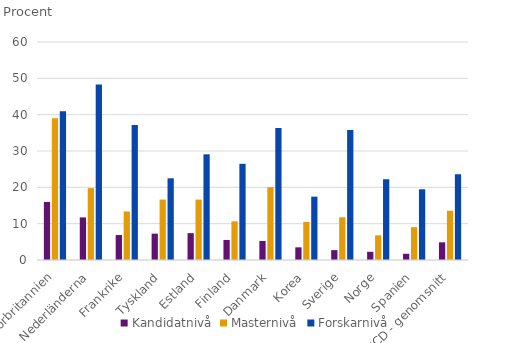
| Category | Kandidatnivå | Masternivå | Forskarnivå |
|---|---|---|---|
| Storbritannien | 15.98 | 38.994 | 40.92 |
| Nederländerna | 11.727 | 19.79 | 48.328 |
| Frankrike | 6.869 | 13.36 | 37.144 |
| Tyskland | 7.255 | 16.639 | 22.484 |
| Estland | 7.393 | 16.63 | 29.089 |
| Finland | 5.517 | 10.644 | 26.474 |
| Danmark | 5.246 | 20.036 | 36.311 |
| Korea | 3.491 | 10.476 | 17.437 |
| Sverige | 2.718 | 11.753 | 35.801 |
| Norge | 2.258 | 6.793 | 22.231 |
| Spanien | 1.718 | 9.039 | 19.464 |
| OECD - genomsnitt | 4.868 | 13.565 | 23.606 |